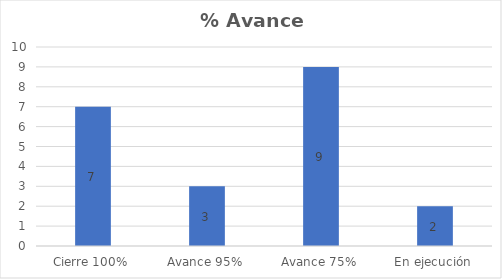
| Category | Series 0 |
|---|---|
| Cierre 100% | 7 |
| Avance 95% | 3 |
| Avance 75% | 9 |
| En ejecución | 2 |